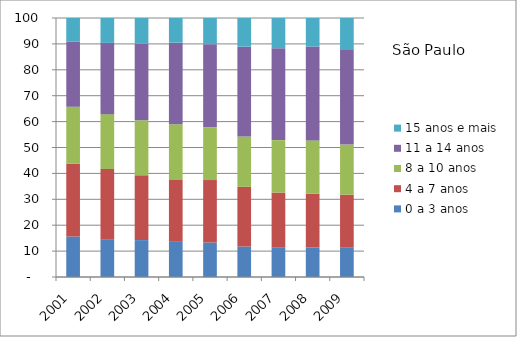
| Category | 0 a 3 anos | 4 a 7 anos | 8 a 10 anos | 11 a 14 anos | 15 anos e mais |
|---|---|---|---|---|---|
| 2001.0 | 15.64 | 28.08 | 22.06 | 25.14 | 9.08 |
| 2002.0 | 14.41 | 27.29 | 21.18 | 27.52 | 9.61 |
| 2003.0 | 14.25 | 25.02 | 21.23 | 29.58 | 9.92 |
| 2004.0 | 13.59 | 23.87 | 21.52 | 31.49 | 9.53 |
| 2005.0 | 13.32 | 24.12 | 20.34 | 32.11 | 10.12 |
| 2006.0 | 11.77 | 23.04 | 19.45 | 34.67 | 11.07 |
| 2007.0 | 11.31 | 21.29 | 20.25 | 35.47 | 11.69 |
| 2008.0 | 11.41 | 20.78 | 20.56 | 36.24 | 11.02 |
| 2009.0 | 11.5 | 20.29 | 19.34 | 36.52 | 12.35 |